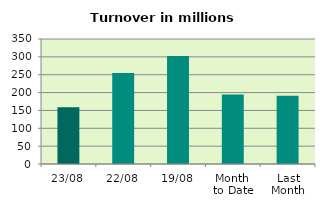
| Category | Series 0 |
|---|---|
| 23/08 | 158.75 |
| 22/08 | 254.701 |
| 19/08 | 302.639 |
| Month 
to Date | 194.678 |
| Last
Month | 191.038 |